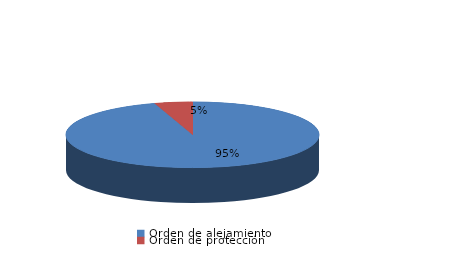
| Category | Series 0 |
|---|---|
| Orden de alejamiento | 59 |
| Orden de protección | 3 |